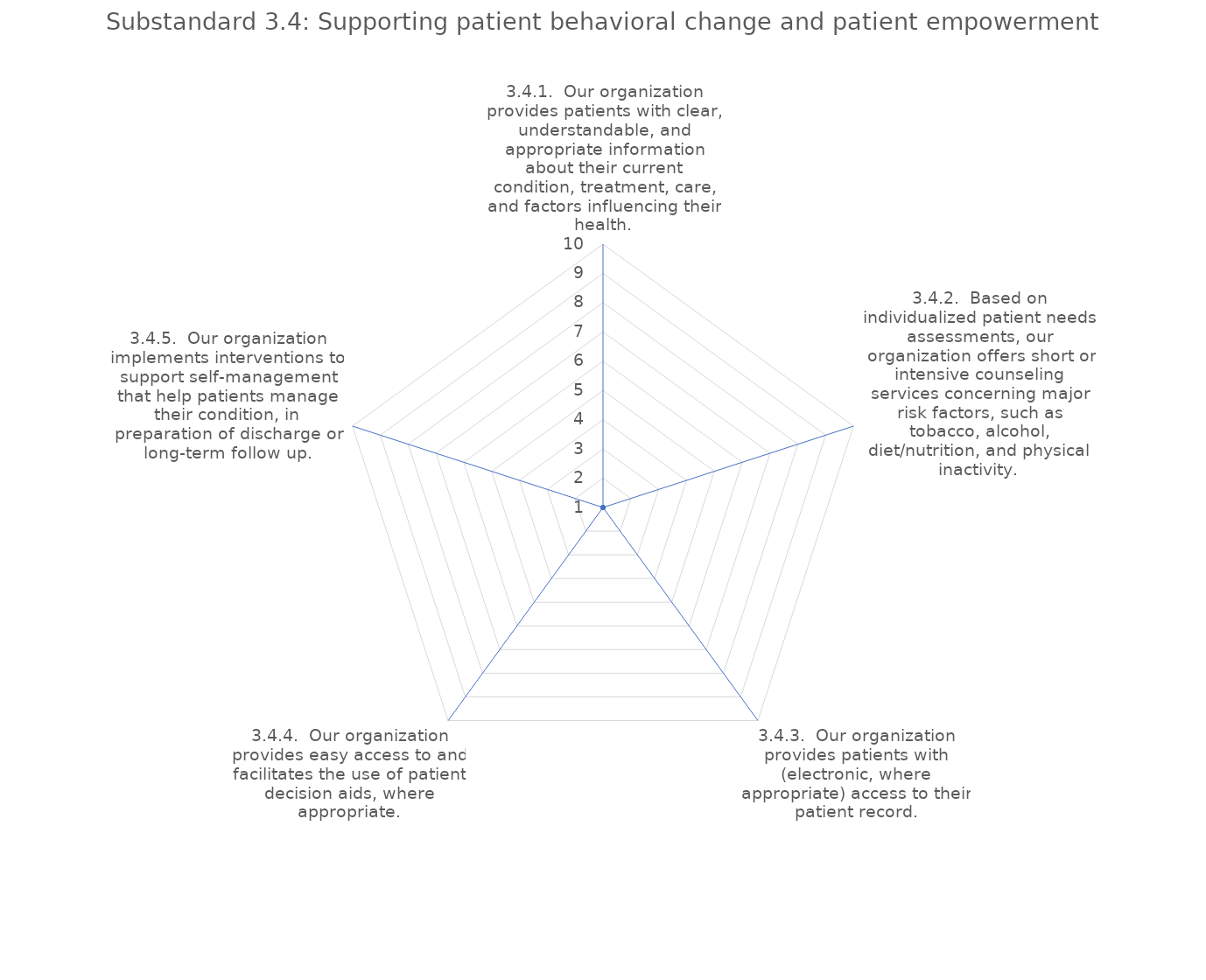
| Category | value |
|---|---|
| 3.4.1.  Our organization provides patients with clear, understandable, and appropriate information about their current condition, treatment, care, and factors influencing their health. | 1 |
| 3.4.2.  Based on individualized patient needs assessments, our organization offers short or intensive counseling services concerning major risk factors, such as tobacco, alcohol, diet/nutrition, and physical inactivity. | 1 |
| 3.4.3.  Our organization provides patients with (electronic, where appropriate) access to their patient record. | 1 |
| 3.4.4.  Our organization provides easy access to and facilitates the use of patient decision aids, where appropriate. | 1 |
| 3.4.5.  Our organization implements interventions to support self-management that help patients manage their condition, in preparation of discharge or long-term follow up. | 1 |